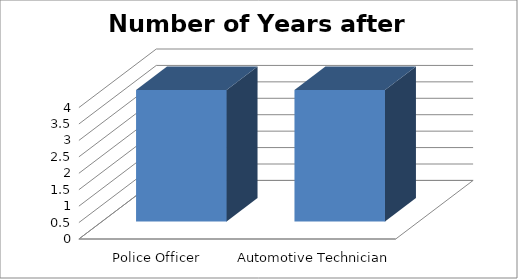
| Category | Number of Years after H.S. |
|---|---|
| Police Officer | 4 |
| Automotive Technician | 4 |